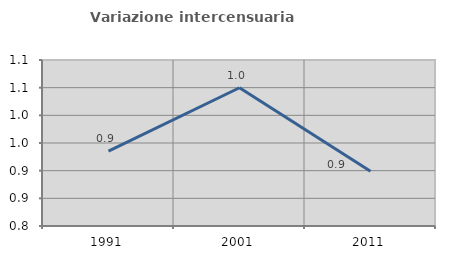
| Category | Variazione intercensuaria annua |
|---|---|
| 1991.0 | 0.935 |
| 2001.0 | 1.05 |
| 2011.0 | 0.899 |